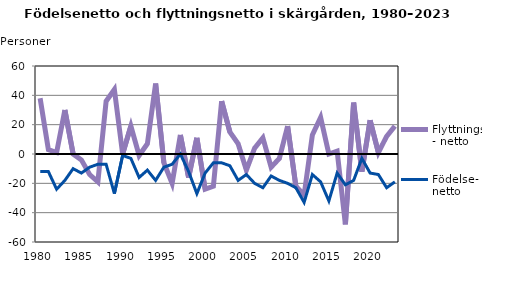
| Category | Flyttnings- netto | Födelse- netto |
|---|---|---|
| 1980.0 | 38 | -12 |
| 1981.0 | 3 | -12 |
| 1982.0 | 1 | -24 |
| 1983.0 | 30 | -18 |
| 1984.0 | 0 | -10 |
| 1985.0 | -4 | -13 |
| 1986.0 | -14 | -9 |
| 1987.0 | -19 | -7 |
| 1988.0 | 36 | -7 |
| 1989.0 | 44 | -27 |
| 1990.0 | 0 | -1 |
| 1991.0 | 19 | -3 |
| 1992.0 | -1 | -16 |
| 1993.0 | 7 | -11 |
| 1994.0 | 48 | -18 |
| 1995.0 | -6 | -9 |
| 1996.0 | -20 | -7 |
| 1997.0 | 13 | 0 |
| 1998.0 | -16 | -12 |
| 1999.0 | 11 | -27 |
| 2000.0 | -24 | -13 |
| 2001.0 | -22 | -6 |
| 2002.0 | 36 | -6 |
| 2003.0 | 15 | -8 |
| 2004.0 | 7 | -18 |
| 2005.0 | -11 | -14 |
| 2006.0 | 4 | -20 |
| 2007.0 | 11 | -23 |
| 2008.0 | -9 | -15 |
| 2009.0 | -3 | -18 |
| 2010.0 | 19 | -20 |
| 2011.0 | -22 | -23 |
| 2012.0 | -28 | -33 |
| 2013.0 | 13 | -14 |
| 2014.0 | 25 | -19 |
| 2015.0 | 0 | -32 |
| 2016.0 | 2 | -13 |
| 2017.0 | -48 | -21 |
| 2018.0 | 35 | -18 |
| 2019.0 | -12 | -3 |
| 2020.0 | 23 | -13 |
| 2021.0 | 1 | -14 |
| 2022.0 | 12 | -23 |
| 2023.0 | 19 | -19 |